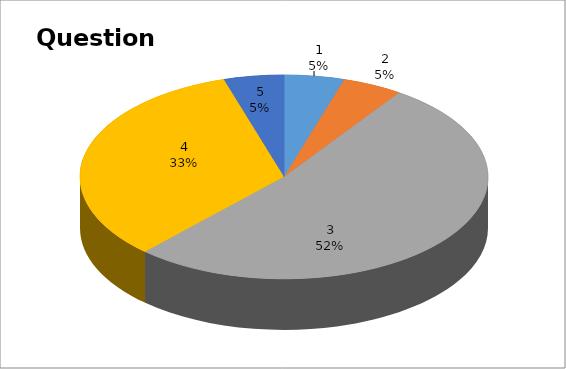
| Category | Series 0 |
|---|---|
| 0 | 1 |
| 1 | 1 |
| 2 | 11 |
| 3 | 7 |
| 4 | 1 |